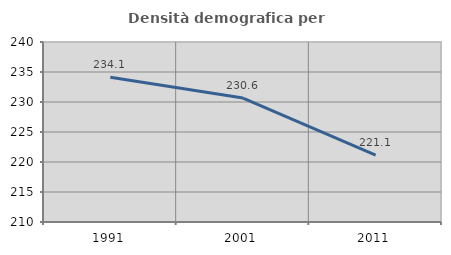
| Category | Densità demografica |
|---|---|
| 1991.0 | 234.14 |
| 2001.0 | 230.649 |
| 2011.0 | 221.146 |